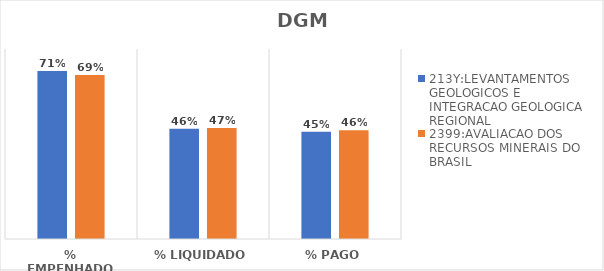
| Category | 213Y:LEVANTAMENTOS GEOLOGICOS E INTEGRACAO GEOLOGICA REGIONAL | 2399:AVALIACAO DOS RECURSOS MINERAIS DO BRASIL |
|---|---|---|
| % EMPENHADO | 0.707 | 0.69 |
| % LIQUIDADO | 0.465 | 0.467 |
| % PAGO | 0.452 | 0.458 |